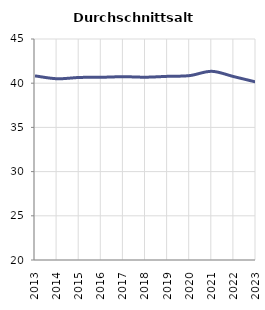
| Category | Durchschnittsalter |
|---|---|
| 2013.0 | 40.829 |
| 2014.0 | 40.502 |
| 2015.0 | 40.649 |
| 2016.0 | 40.671 |
| 2017.0 | 40.735 |
| 2018.0 | 40.68 |
| 2019.0 | 40.776 |
| 2020.0 | 40.86 |
| 2021.0 | 41.344 |
| 2022.0 | 40.74 |
| 2023.0 | 40.135 |